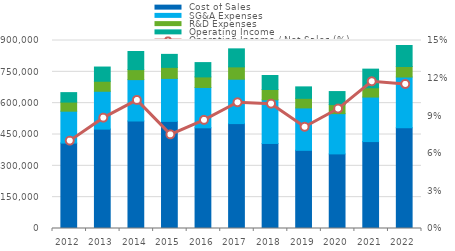
| Category |  Cost of Sales |  SG&A Expenses |  R&D Expenses |  Operating Income |
|---|---|---|---|---|
| 2012.0 | 408954 | 152676 | 43488 | 45343 |
| 2013.0 | 475758 | 181225 | 47928 | 68055 |
| 2014.0 | 514645 | 198103 | 47913 | 86591 |
| 2015.0 | 512792 | 205735 | 52790 | 62287 |
| 2016.0 | 482040 | 193093 | 50539 | 68529 |
| 2017.0 | 502170 | 212481 | 59077 | 86254 |
| 2018.0 | 407097 | 208895 | 49335 | 67254 |
| 2019.0 | 374278 | 202954 | 45988 | 54760 |
| 2020.0 | 357178 | 192687 | 43184 | 62480 |
| 2021.0 | 416100 | 213234 | 44277 | 89316 |
| 2022.0 | 482199 | 243015 | 50182 | 100686 |